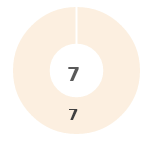
| Category | Series 0 |
|---|---|
| 0 | 0 |
| 1 | 0 |
| 2 | 0 |
| 3 | 0 |
| 4 | 7 |